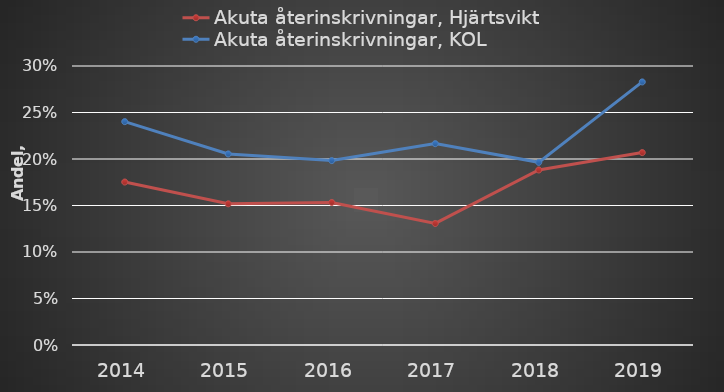
| Category | Akuta återinskrivningar, Hjärtsvikt | Akuta återinskrivningar, KOL  |
|---|---|---|
| 2014 | 0.175 | 0.24 |
| 2015 | 0.152 | 0.205 |
| 2016 | 0.153 | 0.198 |
| 2017 | 0.131 | 0.217 |
| 2018 | 0.188 | 0.196 |
| 2019 | 0.207 | 0.283 |